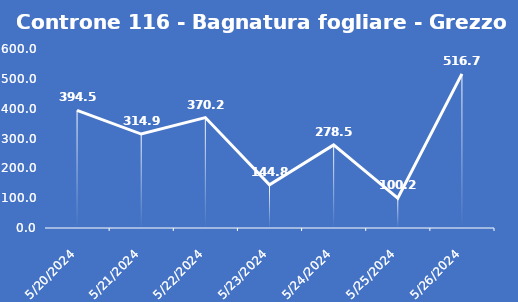
| Category | Controne 116 - Bagnatura fogliare - Grezzo (min) |
|---|---|
| 5/20/24 | 394.5 |
| 5/21/24 | 314.9 |
| 5/22/24 | 370.2 |
| 5/23/24 | 144.8 |
| 5/24/24 | 278.5 |
| 5/25/24 | 100.2 |
| 5/26/24 | 516.7 |